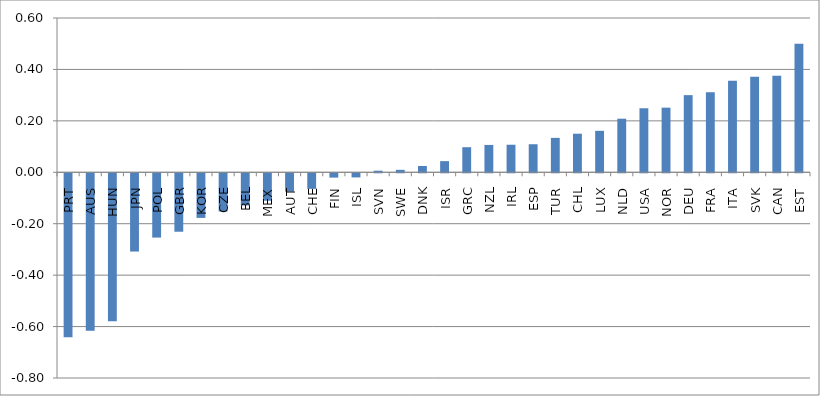
| Category | Series 0 |
|---|---|
| PRT | -0.638 |
| AUS | -0.612 |
| HUN | -0.575 |
| JPN | -0.304 |
| POL | -0.25 |
| GBR | -0.227 |
| KOR | -0.174 |
| CZE | -0.149 |
| BEL | -0.125 |
| MEX | -0.107 |
| AUT | -0.071 |
| CHE | -0.061 |
| FIN | -0.017 |
| ISL | -0.016 |
| SVN | 0.006 |
| SWE | 0.01 |
| DNK | 0.024 |
| ISR | 0.043 |
| GRC | 0.098 |
| NZL | 0.106 |
| IRL | 0.107 |
| ESP | 0.109 |
| TUR | 0.134 |
| CHL | 0.15 |
| LUX | 0.161 |
| NLD | 0.208 |
| USA | 0.249 |
| NOR | 0.251 |
| DEU | 0.3 |
| FRA | 0.311 |
| ITA | 0.356 |
| SVK | 0.372 |
| CAN | 0.375 |
| EST | 0.5 |